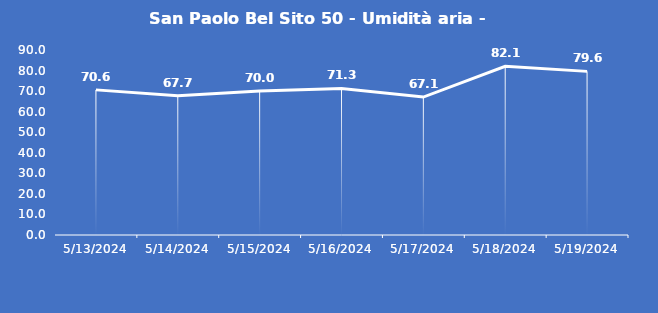
| Category | San Paolo Bel Sito 50 - Umidità aria - Grezzo (%) |
|---|---|
| 5/13/24 | 70.6 |
| 5/14/24 | 67.7 |
| 5/15/24 | 70 |
| 5/16/24 | 71.3 |
| 5/17/24 | 67.1 |
| 5/18/24 | 82.1 |
| 5/19/24 | 79.6 |